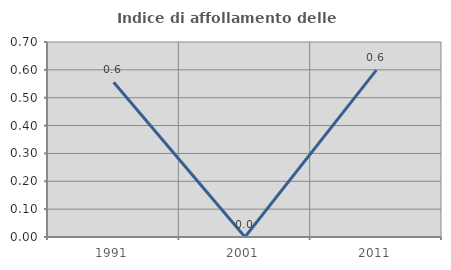
| Category | Indice di affollamento delle abitazioni  |
|---|---|
| 1991.0 | 0.556 |
| 2001.0 | 0 |
| 2011.0 | 0.599 |